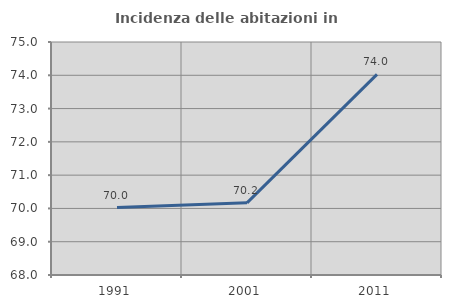
| Category | Incidenza delle abitazioni in proprietà  |
|---|---|
| 1991.0 | 70.027 |
| 2001.0 | 70.167 |
| 2011.0 | 74.026 |